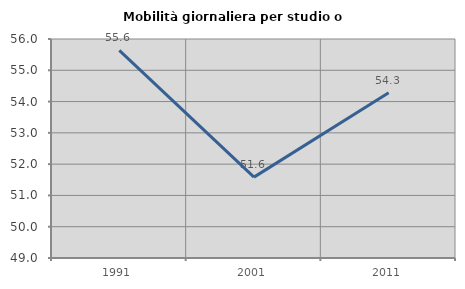
| Category | Mobilità giornaliera per studio o lavoro |
|---|---|
| 1991.0 | 55.637 |
| 2001.0 | 51.585 |
| 2011.0 | 54.28 |